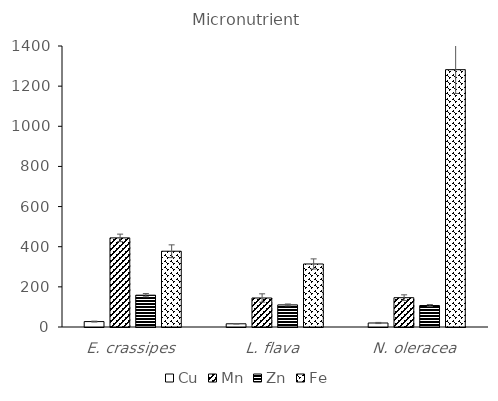
| Category | Cu | Mn | Zn | Fe |
|---|---|---|---|---|
| E. crassipes | 27 | 444 | 158.5 | 377.5 |
| L. flava | 16 | 144.5 | 110 | 314 |
| N. oleracea | 20 | 146 | 107 | 1282 |